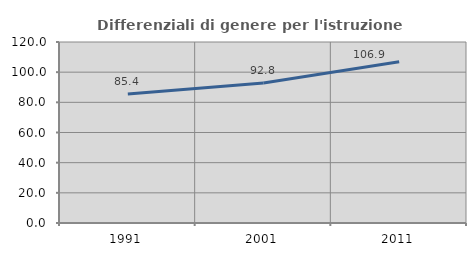
| Category | Differenziali di genere per l'istruzione superiore |
|---|---|
| 1991.0 | 85.449 |
| 2001.0 | 92.799 |
| 2011.0 | 106.885 |